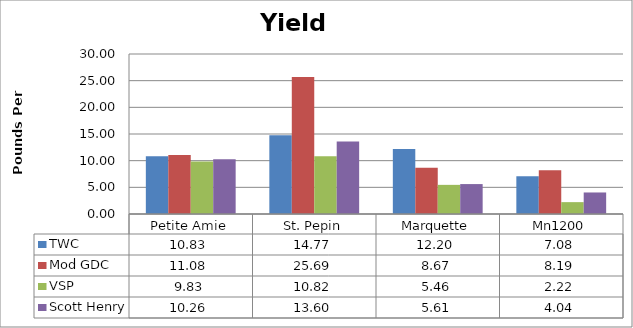
| Category | TWC | Mod GDC | VSP | Scott Henry |
|---|---|---|---|---|
| 0 | 10.826 | 11.078 | 9.826 | 10.259 |
| 1 | 14.775 | 25.689 | 10.822 | 13.6 |
| 2 | 12.204 | 8.67 | 5.463 | 5.611 |
| 3 | 7.078 | 8.191 | 2.224 | 4.037 |